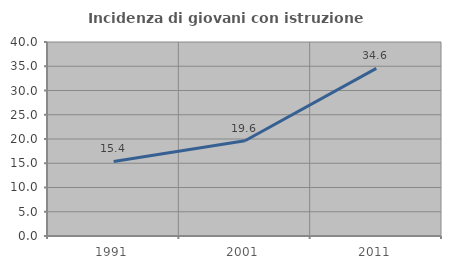
| Category | Incidenza di giovani con istruzione universitaria |
|---|---|
| 1991.0 | 15.364 |
| 2001.0 | 19.628 |
| 2011.0 | 34.556 |